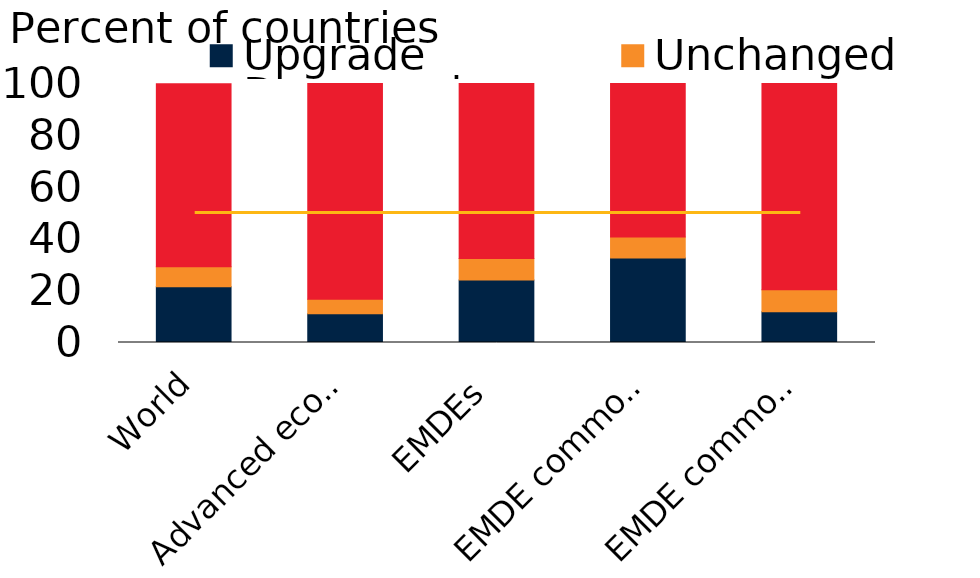
| Category | Upgrade | Unchanged | Downgrade |
|---|---|---|---|
| World | 21.5 | 7.7 | 70.7 |
| Advanced economies | 11.1 | 5.6 | 83.3 |
| EMDEs | 24.1 | 8.3 | 67.6 |
| EMDE commodity exporters | 32.6 | 8.1 | 59.3 |
| EMDE commodity importers | 11.9 | 8.5 | 79.7 |